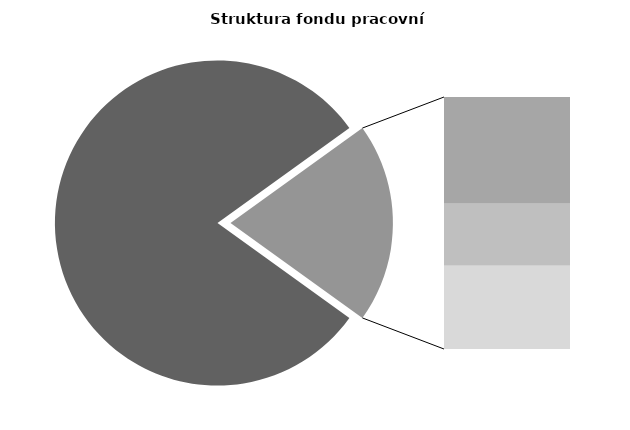
| Category | Series 0 |
|---|---|
| Průměrná měsíční odpracovaná doba bez přesčasu | 135.381 |
| Dovolená | 14.222 |
| Nemoc | 8.232 |
| Jiné | 11.092 |